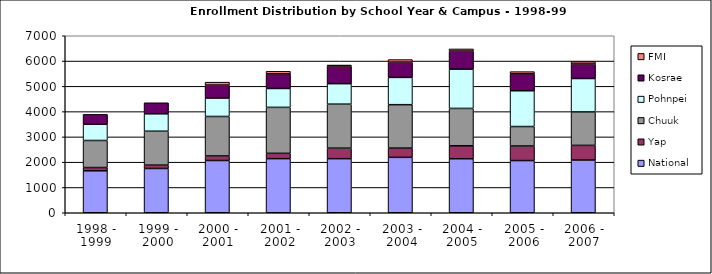
| Category | National | Yap | Chuuk | Pohnpei | Kosrae | FMI |
|---|---|---|---|---|---|---|
| 1998 - 1999 | 1660 | 128 | 1070 | 642 | 391 | 0 |
| 1999 - 2000 | 1751 | 133 | 1341 | 689 | 436 | 0 |
| 2000 - 2001 | 2067 | 179 | 1562 | 729 | 513 | 115 |
| 2001 - 2002 | 2140 | 210 | 1818 | 747 | 579 | 100 |
| 2002 - 2003 | 2139 | 415 | 1741 | 810 | 698 | 39 |
| 2003 - 2004 | 2191 | 366 | 1717 | 1079 | 605 | 100 |
| 2004 - 2005 | 2136 | 513 | 1477 | 1553 | 715 | 85 |
| 2005 - 2006 | 2064 | 576 | 770 | 1415 | 669 | 87 |
| 2006 - 2007 | 2085 | 579 | 1324 | 1321 | 574 | 92 |